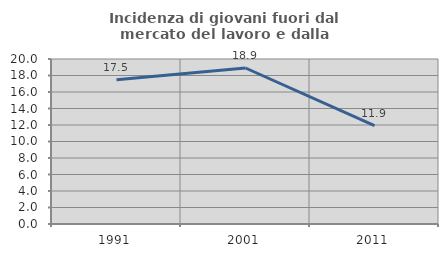
| Category | Incidenza di giovani fuori dal mercato del lavoro e dalla formazione  |
|---|---|
| 1991.0 | 17.493 |
| 2001.0 | 18.909 |
| 2011.0 | 11.923 |